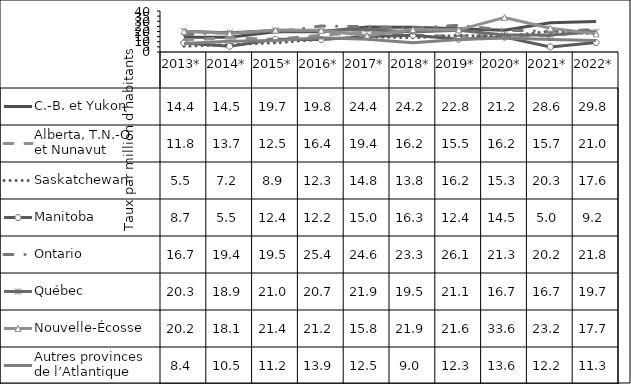
| Category | C.-B. et Yukon | Alberta, T.N.-O. 
et Nunavut | Saskatchewan | Manitoba | Ontario | Québec | Nouvelle-Écosse | Autres provinces 
de l’Atlantique |
|---|---|---|---|---|---|---|---|---|
| 2013* | 14.4 | 11.8 | 5.5 | 8.7 | 16.7 | 20.3 | 20.2 | 8.4 |
| 2014* | 14.5 | 13.7 | 7.2 | 5.5 | 19.4 | 18.9 | 18.1 | 10.5 |
| 2015* | 19.7 | 12.5 | 8.9 | 12.4 | 19.5 | 21 | 21.4 | 11.2 |
| 2016* | 19.8 | 16.4 | 12.3 | 12.2 | 25.4 | 20.7 | 21.2 | 13.9 |
| 2017* | 24.4 | 19.4 | 14.8 | 15 | 24.6 | 21.9 | 15.8 | 12.5 |
| 2018* | 24.2 | 16.2 | 13.8 | 16.3 | 23.3 | 19.5 | 21.9 | 9 |
| 2019* | 22.8 | 15.5 | 16.2 | 12.4 | 26.1 | 21.1 | 21.6 | 12.3 |
| 2020* | 21.2 | 16.2 | 15.3 | 14.5 | 21.3 | 16.7 | 33.6 | 13.6 |
| 2021* | 28.6 | 15.7 | 20.3 | 5 | 20.2 | 16.7 | 23.2 | 12.2 |
| 2022* | 29.8 | 21 | 17.6 | 9.2 | 21.8 | 19.7 | 17.7 | 11.3 |